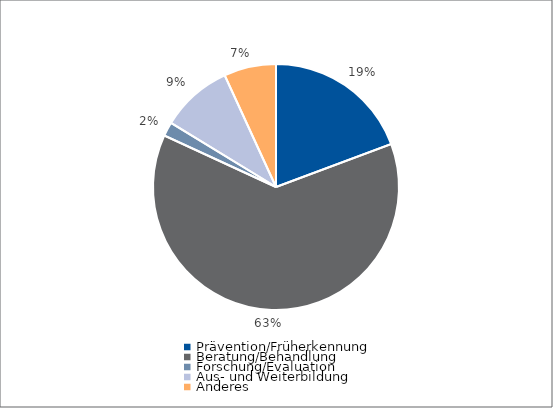
| Category | Series 0 |
|---|---|
| Prävention/Früherkennung | 19780.4 |
| Beratung/Behandlung | 64040.05 |
| Forschung/Evaluation | 1884.75 |
| Aus- und Weiterbildung | 9658.35 |
| Anderes | 7015.9 |